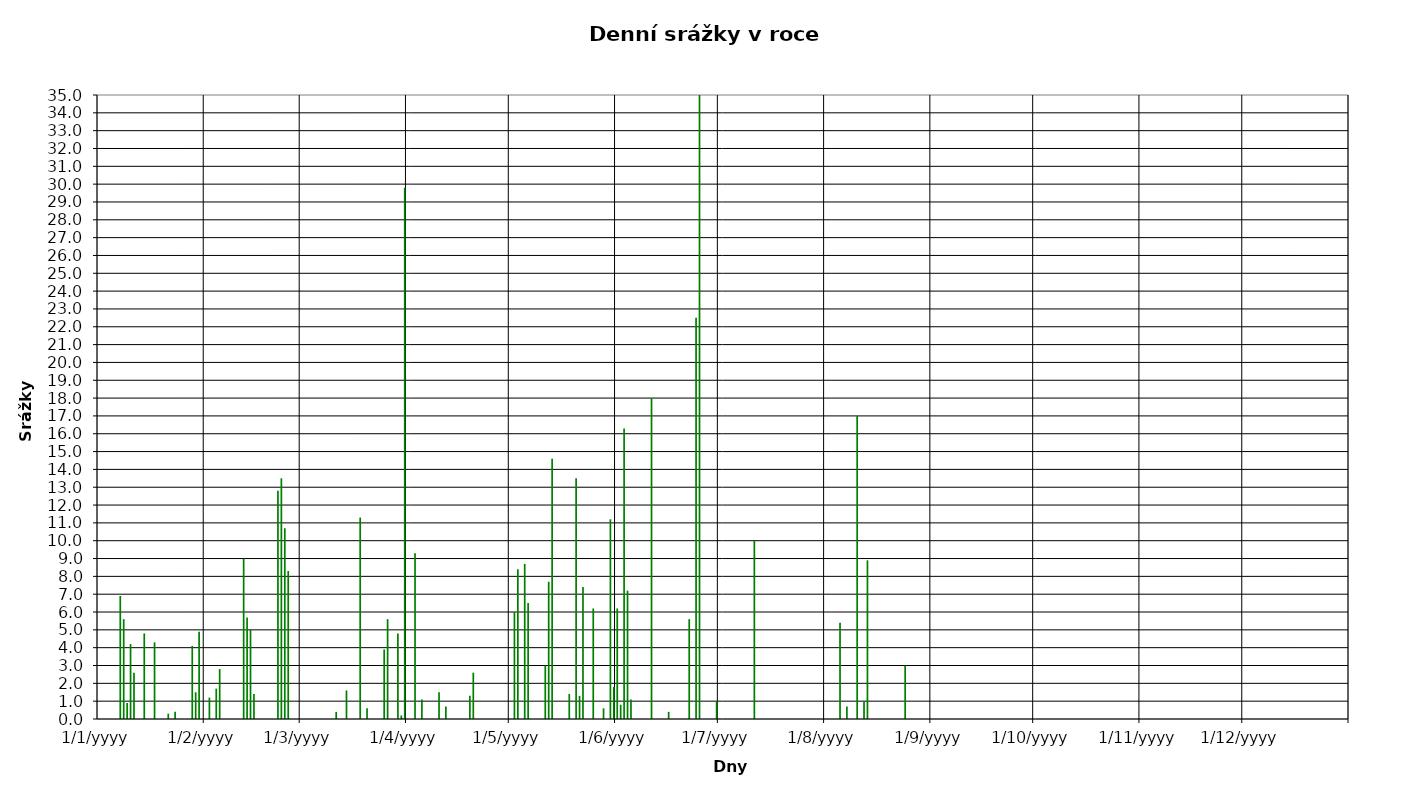
| Category | Series 0 |
|---|---|
| 2013-01-01 | 0 |
| 2013-01-02 | 0 |
| 2013-01-03 | 0 |
| 2013-01-04 | 0 |
| 2013-01-05 | 0 |
| 2013-01-06 | 0 |
| 2013-01-07 | 6.9 |
| 2013-01-08 | 5.6 |
| 2013-01-09 | 0.9 |
| 2013-01-10 | 4.2 |
| 2013-01-11 | 2.6 |
| 2013-01-12 | 0 |
| 2013-01-13 | 0 |
| 2013-01-14 | 4.8 |
| 2013-01-15 | 0 |
| 2013-01-16 | 0 |
| 2013-01-17 | 4.3 |
| 2013-01-18 | 0 |
| 2013-01-19 | 0 |
| 2013-01-20 | 0 |
| 2013-01-21 | 0.3 |
| 2013-01-22 | 0 |
| 2013-01-23 | 0.4 |
| 2013-01-24 | 0 |
| 2013-01-25 | 0 |
| 2013-01-26 | 0 |
| 2013-01-27 | 0 |
| 2013-01-28 | 4.1 |
| 2013-01-29 | 1.5 |
| 2013-01-30 | 4.9 |
| 2013-01-31 | 0 |
| 2013-02-01 | 0 |
| 2013-02-02 | 1.2 |
| 2013-02-03 | 0 |
| 2013-02-04 | 1.7 |
| 2013-02-05 | 2.8 |
| 2013-02-06 | 0 |
| 2013-02-07 | 0 |
| 2013-02-08 | 0 |
| 2013-02-09 | 0 |
| 2013-02-10 | 0 |
| 2013-02-11 | 0 |
| 2013-02-12 | 9 |
| 2013-02-13 | 5.7 |
| 2013-02-14 | 5 |
| 2013-02-15 | 1.4 |
| 2013-02-16 | 0 |
| 2013-02-17 | 0 |
| 2013-02-18 | 0 |
| 2013-02-19 | 0 |
| 2013-02-20 | 0 |
| 2013-02-21 | 0 |
| 2013-02-22 | 12.8 |
| 2013-02-23 | 13.5 |
| 2013-02-24 | 10.7 |
| 2013-02-25 | 8.3 |
| 2013-02-26 | 0 |
| 2013-02-27 | 0 |
| 2013-02-28 | 0 |
| 2013-03-01 | 0 |
| 2013-03-02 | 0 |
| 2013-03-03 | 0 |
| 2013-03-04 | 0 |
| 2013-03-05 | 0 |
| 2013-03-06 | 0 |
| 2013-03-07 | 0 |
| 2013-03-08 | 0 |
| 2013-03-09 | 0 |
| 2013-03-10 | 0 |
| 2013-03-11 | 0.4 |
| 2013-03-12 | 0 |
| 2013-03-13 | 0 |
| 2013-03-14 | 1.6 |
| 2013-03-15 | 0 |
| 2013-03-16 | 0 |
| 2013-03-17 | 0 |
| 2013-03-18 | 11.3 |
| 2013-03-19 | 0 |
| 2013-03-20 | 0.6 |
| 2013-03-21 | 0 |
| 2013-03-22 | 0 |
| 2013-03-23 | 0 |
| 2013-03-24 | 0 |
| 2013-03-25 | 3.9 |
| 2013-03-26 | 5.6 |
| 2013-03-27 | 0 |
| 2013-03-28 | 0 |
| 2013-03-29 | 4.8 |
| 2013-03-30 | 0.2 |
| 2013-03-31 | 29.8 |
| 2013-04-01 | 0 |
| 2013-04-02 | 0 |
| 2013-04-03 | 9.3 |
| 2013-04-04 | 0 |
| 2013-04-05 | 1.1 |
| 2013-04-06 | 0 |
| 2013-04-07 | 0 |
| 2013-04-08 | 0 |
| 2013-04-09 | 0 |
| 2013-04-10 | 1.5 |
| 2013-04-11 | 0 |
| 2013-04-12 | 0.7 |
| 2013-04-13 | 0 |
| 2013-04-14 | 0 |
| 2013-04-15 | 0 |
| 2013-04-16 | 0 |
| 2013-04-17 | 0 |
| 2013-04-18 | 0 |
| 2013-04-19 | 1.3 |
| 2013-04-20 | 2.6 |
| 2013-04-21 | 0 |
| 2013-04-22 | 0 |
| 2013-04-23 | 0 |
| 2013-04-24 | 0 |
| 2013-04-25 | 0 |
| 2013-04-26 | 0 |
| 2013-04-27 | 0 |
| 2013-04-28 | 0 |
| 2013-04-29 | 0 |
| 2013-04-30 | 0 |
| 2013-05-01 | 0 |
| 2013-05-02 | 6 |
| 2013-05-03 | 8.4 |
| 2013-05-04 | 0 |
| 2013-05-05 | 8.7 |
| 2013-05-06 | 6.5 |
| 2013-05-07 | 0 |
| 2013-05-08 | 0 |
| 2013-05-09 | 0 |
| 2013-05-10 | 0 |
| 2013-05-11 | 3 |
| 2013-05-12 | 7.7 |
| 2013-05-13 | 14.6 |
| 2013-05-14 | 0 |
| 2013-05-15 | 0 |
| 2013-05-16 | 0 |
| 2013-05-17 | 0 |
| 2013-05-18 | 1.4 |
| 2013-05-19 | 0 |
| 2013-05-20 | 13.5 |
| 2013-05-21 | 1.3 |
| 2013-05-22 | 7.4 |
| 2013-05-23 | 0 |
| 2013-05-24 | 0 |
| 2013-05-25 | 6.2 |
| 2013-05-26 | 0 |
| 2013-05-27 | 0 |
| 2013-05-28 | 0.6 |
| 2013-05-29 | 0 |
| 2013-05-30 | 11.2 |
| 2013-05-31 | 1.8 |
| 2013-06-01 | 6.2 |
| 2013-06-02 | 0.8 |
| 2013-06-03 | 16.3 |
| 2013-06-04 | 7.2 |
| 2013-06-05 | 1.1 |
| 2013-06-06 | 0 |
| 2013-06-07 | 0 |
| 2013-06-08 | 0 |
| 2013-06-09 | 0 |
| 2013-06-10 | 0 |
| 2013-06-11 | 18 |
| 2013-06-12 | 0 |
| 2013-06-13 | 0 |
| 2013-06-14 | 0 |
| 2013-06-15 | 0 |
| 2013-06-16 | 0.4 |
| 2013-06-17 | 0 |
| 2013-06-18 | 0 |
| 2013-06-19 | 0 |
| 2013-06-20 | 0 |
| 2013-06-21 | 0 |
| 2013-06-22 | 5.6 |
| 2013-06-23 | 0 |
| 2013-06-24 | 22.5 |
| 2013-06-25 | 51.9 |
| 2013-06-26 | 0 |
| 2013-06-27 | 0 |
| 2013-06-28 | 0 |
| 2013-06-29 | 0 |
| 2013-06-30 | 1 |
| 2013-07-01 | 0 |
| 2013-07-02 | 0 |
| 2013-07-03 | 0 |
| 2013-07-04 | 0 |
| 2013-07-05 | 0 |
| 2013-07-06 | 0 |
| 2013-07-07 | 0 |
| 2013-07-08 | 0 |
| 2013-07-09 | 0 |
| 2013-07-10 | 0 |
| 2013-07-11 | 10 |
| 2013-07-12 | 0 |
| 2013-07-13 | 0 |
| 2013-07-14 | 0 |
| 2013-07-15 | 0 |
| 2013-07-16 | 0 |
| 2013-07-17 | 0 |
| 2013-07-18 | 0 |
| 2013-07-19 | 0 |
| 2013-07-20 | 0 |
| 2013-07-21 | 0 |
| 2013-07-22 | 0 |
| 2013-07-23 | 0 |
| 2013-07-24 | 0 |
| 2013-07-25 | 0 |
| 2013-07-26 | 0 |
| 2013-07-27 | 0 |
| 2013-07-28 | 0 |
| 2013-07-29 | 0 |
| 2013-07-30 | 0 |
| 2013-07-31 | 0 |
| 2013-08-01 | 0 |
| 2013-08-02 | 0 |
| 2013-08-03 | 0 |
| 2013-08-04 | 0 |
| 2013-08-05 | 5.4 |
| 2013-08-06 | 0 |
| 2013-08-07 | 0.7 |
| 2013-08-08 | 0 |
| 2013-08-09 | 0 |
| 2013-08-10 | 17 |
| 2013-08-11 | 0 |
| 2013-08-12 | 1 |
| 2013-08-13 | 8.9 |
| 2013-08-14 | 0 |
| 2013-08-15 | 0 |
| 2013-08-16 | 0 |
| 2013-08-17 | 0 |
| 2013-08-18 | 0 |
| 2013-08-19 | 0 |
| 2013-08-20 | 0 |
| 2013-08-21 | 0 |
| 2013-08-22 | 0 |
| 2013-08-23 | 0 |
| 2013-08-24 | 3 |
| 2013-08-25 | 0 |
| 2013-08-26 | 0 |
| 2013-08-27 | 0 |
| 2013-08-28 | 0 |
| 2013-08-29 | 0 |
| 2013-08-30 | 0 |
| 2013-08-31 | 0 |
| 2013-09-01 | 0 |
| 2013-09-02 | 0 |
| 2013-09-03 | 0 |
| 2013-09-04 | 0 |
| 2013-09-05 | 0 |
| 2013-09-06 | 0 |
| 2013-09-07 | 0 |
| 2013-09-08 | 0 |
| 2013-09-09 | 0 |
| 2013-09-10 | 0 |
| 2013-09-11 | 0 |
| 2013-09-12 | 0 |
| 2013-09-13 | 0 |
| 2013-09-14 | 0 |
| 2013-09-15 | 0 |
| 2013-09-16 | 0 |
| 2013-09-17 | 0 |
| 2013-09-18 | 0 |
| 2013-09-19 | 0 |
| 2013-09-20 | 0 |
| 2013-09-21 | 0 |
| 2013-09-22 | 0 |
| 2013-09-23 | 0 |
| 2013-09-24 | 0 |
| 2013-09-25 | 0 |
| 2013-09-26 | 0 |
| 2013-09-27 | 0 |
| 2013-09-28 | 0 |
| 2013-09-29 | 0 |
| 2013-09-30 | 0 |
| 2013-10-01 | 0 |
| 2013-10-02 | 0 |
| 2013-10-03 | 0 |
| 2013-10-04 | 0 |
| 2013-10-05 | 0 |
| 2013-10-06 | 0 |
| 2013-10-07 | 0 |
| 2013-10-08 | 0 |
| 2013-10-09 | 0 |
| 2013-10-10 | 0 |
| 2013-10-11 | 0 |
| 2013-10-12 | 0 |
| 2013-10-13 | 0 |
| 2013-10-14 | 0 |
| 2013-10-15 | 0 |
| 2013-10-16 | 0 |
| 2013-10-17 | 0 |
| 2013-10-18 | 0 |
| 2013-10-19 | 0 |
| 2013-10-20 | 0 |
| 2013-10-21 | 0 |
| 2013-10-22 | 0 |
| 2013-10-23 | 0 |
| 2013-10-24 | 0 |
| 2013-10-25 | 0 |
| 2013-10-26 | 0 |
| 2013-10-27 | 0 |
| 2013-10-28 | 0 |
| 2013-10-29 | 0 |
| 2013-10-30 | 0 |
| 2013-10-31 | 0 |
| 2013-11-01 | 0 |
| 2013-11-02 | 0 |
| 2013-11-03 | 0 |
| 2013-11-04 | 0 |
| 2013-11-05 | 0 |
| 2013-11-06 | 0 |
| 2013-11-07 | 0 |
| 2013-11-08 | 0 |
| 2013-11-09 | 0 |
| 2013-11-10 | 0 |
| 2013-11-11 | 0 |
| 2013-11-12 | 0 |
| 2013-11-13 | 0 |
| 2013-11-14 | 0 |
| 2013-11-15 | 0 |
| 2013-11-16 | 0 |
| 2013-11-17 | 0 |
| 2013-11-18 | 0 |
| 2013-11-19 | 0 |
| 2013-11-20 | 0 |
| 2013-11-21 | 0 |
| 2013-11-22 | 0 |
| 2013-11-23 | 0 |
| 2013-11-24 | 0 |
| 2013-11-25 | 0 |
| 2013-11-26 | 0 |
| 2013-11-27 | 0 |
| 2013-11-28 | 0 |
| 2013-11-29 | 0 |
| 2013-11-30 | 0 |
| 2013-12-01 | 0 |
| 2013-12-02 | 0 |
| 2013-12-03 | 0 |
| 2013-12-04 | 0 |
| 2013-12-05 | 0 |
| 2013-12-06 | 0 |
| 2013-12-07 | 0 |
| 2013-12-08 | 0 |
| 2013-12-09 | 0 |
| 2013-12-10 | 0 |
| 2013-12-11 | 0 |
| 2013-12-12 | 0 |
| 2013-12-13 | 0 |
| 2013-12-14 | 0 |
| 2013-12-15 | 0 |
| 2013-12-16 | 0 |
| 2013-12-17 | 0 |
| 2013-12-18 | 0 |
| 2013-12-19 | 0 |
| 2013-12-20 | 0 |
| 2013-12-21 | 0 |
| 2013-12-22 | 0 |
| 2013-12-23 | 0 |
| 2013-12-24 | 0 |
| 2013-12-25 | 0 |
| 2013-12-26 | 0 |
| 2013-12-27 | 0 |
| 2013-12-28 | 0 |
| 2013-12-29 | 0 |
| 2013-12-30 | 0 |
| 2013-12-31 | 0 |